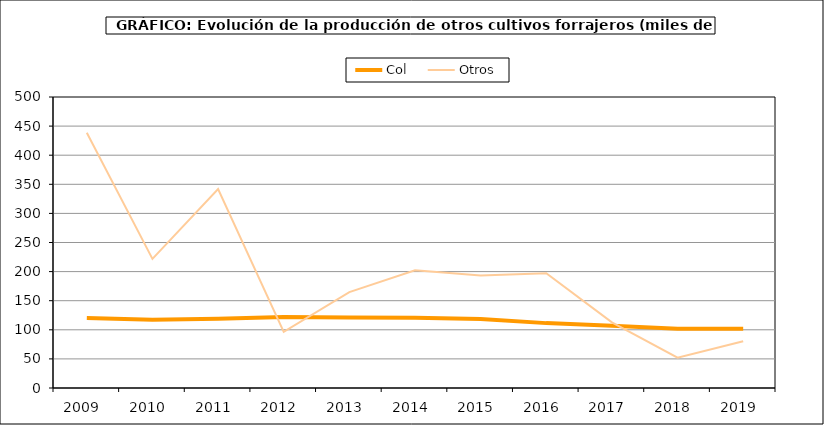
| Category | Col | Otros |
|---|---|---|
| 2009.0 | 120.292 | 438.536 |
| 2010.0 | 117.345 | 221.872 |
| 2011.0 | 118.869 | 341.873 |
| 2012.0 | 122.008 | 96.567 |
| 2013.0 | 121.043 | 164.745 |
| 2014.0 | 120.638 | 202.445 |
| 2015.0 | 118.726 | 193.293 |
| 2016.0 | 111.472 | 197.303 |
| 2017.0 | 107.156 | 112.906 |
| 2018.0 | 101.713 | 52.117 |
| 2019.0 | 101.713 | 80.354 |